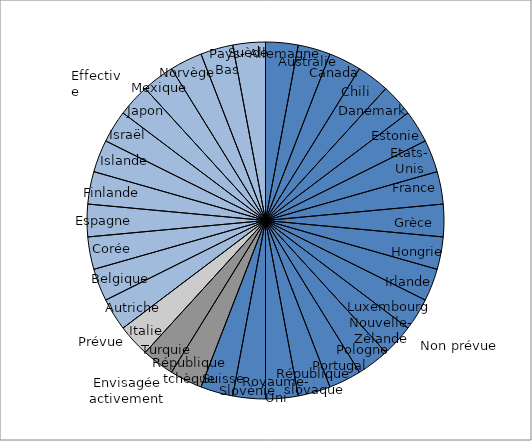
| Category | Statut de la budgétisation au service de l’égalité hommes-femmes |
|---|---|
| DEU | 0.029 |
| AUS | 0.029 |
| CAN | 0.029 |
| CHL | 0.029 |
| DNK | 0.029 |
| EST | 0.029 |
| USA | 0.029 |
| FRA | 0.029 |
| GRC | 0.029 |
| HUN | 0.029 |
| IRL | 0.029 |
| LUX | 0.029 |
| NZL | 0.029 |
| POL | 0.029 |
| PRT | 0.029 |
| SVK | 0.029 |
| GBR | 0.029 |
| SVN | 0.029 |
| CHE | 0.029 |
| CZE | 0.029 |
| TUR | 0.029 |
| ITA | 0.029 |
| AUT | 0.029 |
| BEL | 0.029 |
| KOR | 0.029 |
| ESP | 0.029 |
| FIN | 0.029 |
| ISL | 0.029 |
| ISR | 0.029 |
| JPN | 0.029 |
| MEX | 0.029 |
| NOR | 0.029 |
| NLD | 0.029 |
| SWE | 0.029 |